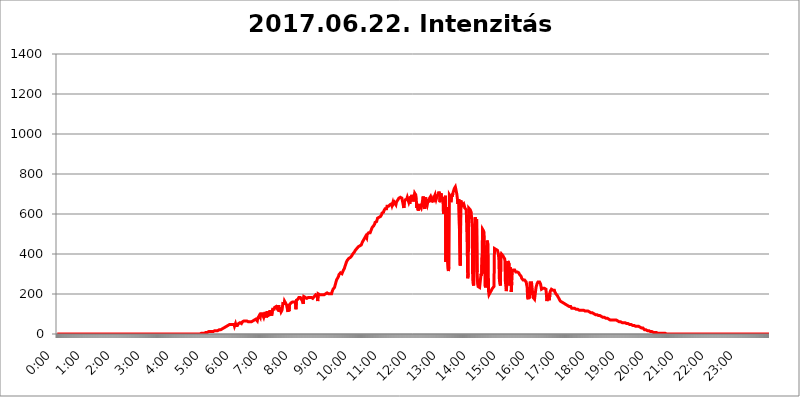
| Category | 2017.06.22. Intenzitás [W/m^2] |
|---|---|
| 0.0 | 0 |
| 0.0006944444444444445 | 0 |
| 0.001388888888888889 | 0 |
| 0.0020833333333333333 | 0 |
| 0.002777777777777778 | 0 |
| 0.003472222222222222 | 0 |
| 0.004166666666666667 | 0 |
| 0.004861111111111111 | 0 |
| 0.005555555555555556 | 0 |
| 0.0062499999999999995 | 0 |
| 0.006944444444444444 | 0 |
| 0.007638888888888889 | 0 |
| 0.008333333333333333 | 0 |
| 0.009027777777777779 | 0 |
| 0.009722222222222222 | 0 |
| 0.010416666666666666 | 0 |
| 0.011111111111111112 | 0 |
| 0.011805555555555555 | 0 |
| 0.012499999999999999 | 0 |
| 0.013194444444444444 | 0 |
| 0.013888888888888888 | 0 |
| 0.014583333333333332 | 0 |
| 0.015277777777777777 | 0 |
| 0.015972222222222224 | 0 |
| 0.016666666666666666 | 0 |
| 0.017361111111111112 | 0 |
| 0.018055555555555557 | 0 |
| 0.01875 | 0 |
| 0.019444444444444445 | 0 |
| 0.02013888888888889 | 0 |
| 0.020833333333333332 | 0 |
| 0.02152777777777778 | 0 |
| 0.022222222222222223 | 0 |
| 0.02291666666666667 | 0 |
| 0.02361111111111111 | 0 |
| 0.024305555555555556 | 0 |
| 0.024999999999999998 | 0 |
| 0.025694444444444447 | 0 |
| 0.02638888888888889 | 0 |
| 0.027083333333333334 | 0 |
| 0.027777777777777776 | 0 |
| 0.02847222222222222 | 0 |
| 0.029166666666666664 | 0 |
| 0.029861111111111113 | 0 |
| 0.030555555555555555 | 0 |
| 0.03125 | 0 |
| 0.03194444444444445 | 0 |
| 0.03263888888888889 | 0 |
| 0.03333333333333333 | 0 |
| 0.034027777777777775 | 0 |
| 0.034722222222222224 | 0 |
| 0.035416666666666666 | 0 |
| 0.036111111111111115 | 0 |
| 0.03680555555555556 | 0 |
| 0.0375 | 0 |
| 0.03819444444444444 | 0 |
| 0.03888888888888889 | 0 |
| 0.03958333333333333 | 0 |
| 0.04027777777777778 | 0 |
| 0.04097222222222222 | 0 |
| 0.041666666666666664 | 0 |
| 0.042361111111111106 | 0 |
| 0.04305555555555556 | 0 |
| 0.043750000000000004 | 0 |
| 0.044444444444444446 | 0 |
| 0.04513888888888889 | 0 |
| 0.04583333333333334 | 0 |
| 0.04652777777777778 | 0 |
| 0.04722222222222222 | 0 |
| 0.04791666666666666 | 0 |
| 0.04861111111111111 | 0 |
| 0.049305555555555554 | 0 |
| 0.049999999999999996 | 0 |
| 0.05069444444444445 | 0 |
| 0.051388888888888894 | 0 |
| 0.052083333333333336 | 0 |
| 0.05277777777777778 | 0 |
| 0.05347222222222222 | 0 |
| 0.05416666666666667 | 0 |
| 0.05486111111111111 | 0 |
| 0.05555555555555555 | 0 |
| 0.05625 | 0 |
| 0.05694444444444444 | 0 |
| 0.057638888888888885 | 0 |
| 0.05833333333333333 | 0 |
| 0.05902777777777778 | 0 |
| 0.059722222222222225 | 0 |
| 0.06041666666666667 | 0 |
| 0.061111111111111116 | 0 |
| 0.06180555555555556 | 0 |
| 0.0625 | 0 |
| 0.06319444444444444 | 0 |
| 0.06388888888888888 | 0 |
| 0.06458333333333334 | 0 |
| 0.06527777777777778 | 0 |
| 0.06597222222222222 | 0 |
| 0.06666666666666667 | 0 |
| 0.06736111111111111 | 0 |
| 0.06805555555555555 | 0 |
| 0.06874999999999999 | 0 |
| 0.06944444444444443 | 0 |
| 0.07013888888888889 | 0 |
| 0.07083333333333333 | 0 |
| 0.07152777777777779 | 0 |
| 0.07222222222222223 | 0 |
| 0.07291666666666667 | 0 |
| 0.07361111111111111 | 0 |
| 0.07430555555555556 | 0 |
| 0.075 | 0 |
| 0.07569444444444444 | 0 |
| 0.0763888888888889 | 0 |
| 0.07708333333333334 | 0 |
| 0.07777777777777778 | 0 |
| 0.07847222222222222 | 0 |
| 0.07916666666666666 | 0 |
| 0.0798611111111111 | 0 |
| 0.08055555555555556 | 0 |
| 0.08125 | 0 |
| 0.08194444444444444 | 0 |
| 0.08263888888888889 | 0 |
| 0.08333333333333333 | 0 |
| 0.08402777777777777 | 0 |
| 0.08472222222222221 | 0 |
| 0.08541666666666665 | 0 |
| 0.08611111111111112 | 0 |
| 0.08680555555555557 | 0 |
| 0.08750000000000001 | 0 |
| 0.08819444444444445 | 0 |
| 0.08888888888888889 | 0 |
| 0.08958333333333333 | 0 |
| 0.09027777777777778 | 0 |
| 0.09097222222222222 | 0 |
| 0.09166666666666667 | 0 |
| 0.09236111111111112 | 0 |
| 0.09305555555555556 | 0 |
| 0.09375 | 0 |
| 0.09444444444444444 | 0 |
| 0.09513888888888888 | 0 |
| 0.09583333333333333 | 0 |
| 0.09652777777777777 | 0 |
| 0.09722222222222222 | 0 |
| 0.09791666666666667 | 0 |
| 0.09861111111111111 | 0 |
| 0.09930555555555555 | 0 |
| 0.09999999999999999 | 0 |
| 0.10069444444444443 | 0 |
| 0.1013888888888889 | 0 |
| 0.10208333333333335 | 0 |
| 0.10277777777777779 | 0 |
| 0.10347222222222223 | 0 |
| 0.10416666666666667 | 0 |
| 0.10486111111111111 | 0 |
| 0.10555555555555556 | 0 |
| 0.10625 | 0 |
| 0.10694444444444444 | 0 |
| 0.1076388888888889 | 0 |
| 0.10833333333333334 | 0 |
| 0.10902777777777778 | 0 |
| 0.10972222222222222 | 0 |
| 0.1111111111111111 | 0 |
| 0.11180555555555556 | 0 |
| 0.11180555555555556 | 0 |
| 0.1125 | 0 |
| 0.11319444444444444 | 0 |
| 0.11388888888888889 | 0 |
| 0.11458333333333333 | 0 |
| 0.11527777777777777 | 0 |
| 0.11597222222222221 | 0 |
| 0.11666666666666665 | 0 |
| 0.1173611111111111 | 0 |
| 0.11805555555555557 | 0 |
| 0.11944444444444445 | 0 |
| 0.12013888888888889 | 0 |
| 0.12083333333333333 | 0 |
| 0.12152777777777778 | 0 |
| 0.12222222222222223 | 0 |
| 0.12291666666666667 | 0 |
| 0.12291666666666667 | 0 |
| 0.12361111111111112 | 0 |
| 0.12430555555555556 | 0 |
| 0.125 | 0 |
| 0.12569444444444444 | 0 |
| 0.12638888888888888 | 0 |
| 0.12708333333333333 | 0 |
| 0.16875 | 0 |
| 0.12847222222222224 | 0 |
| 0.12916666666666668 | 0 |
| 0.12986111111111112 | 0 |
| 0.13055555555555556 | 0 |
| 0.13125 | 0 |
| 0.13194444444444445 | 0 |
| 0.1326388888888889 | 0 |
| 0.13333333333333333 | 0 |
| 0.13402777777777777 | 0 |
| 0.13402777777777777 | 0 |
| 0.13472222222222222 | 0 |
| 0.13541666666666666 | 0 |
| 0.1361111111111111 | 0 |
| 0.13749999999999998 | 0 |
| 0.13819444444444443 | 0 |
| 0.1388888888888889 | 0 |
| 0.13958333333333334 | 0 |
| 0.14027777777777778 | 0 |
| 0.14097222222222222 | 0 |
| 0.14166666666666666 | 0 |
| 0.1423611111111111 | 0 |
| 0.14305555555555557 | 0 |
| 0.14375000000000002 | 0 |
| 0.14444444444444446 | 0 |
| 0.1451388888888889 | 0 |
| 0.1451388888888889 | 0 |
| 0.14652777777777778 | 0 |
| 0.14722222222222223 | 0 |
| 0.14791666666666667 | 0 |
| 0.1486111111111111 | 0 |
| 0.14930555555555555 | 0 |
| 0.15 | 0 |
| 0.15069444444444444 | 0 |
| 0.15138888888888888 | 0 |
| 0.15208333333333332 | 0 |
| 0.15277777777777776 | 0 |
| 0.15347222222222223 | 0 |
| 0.15416666666666667 | 0 |
| 0.15486111111111112 | 0 |
| 0.15555555555555556 | 0 |
| 0.15625 | 0 |
| 0.15694444444444444 | 0 |
| 0.15763888888888888 | 0 |
| 0.15833333333333333 | 0 |
| 0.15902777777777777 | 0 |
| 0.15972222222222224 | 0 |
| 0.16041666666666668 | 0 |
| 0.16111111111111112 | 0 |
| 0.16180555555555556 | 0 |
| 0.1625 | 0 |
| 0.16319444444444445 | 0 |
| 0.1638888888888889 | 0 |
| 0.16458333333333333 | 0 |
| 0.16527777777777777 | 0 |
| 0.16597222222222222 | 0 |
| 0.16666666666666666 | 0 |
| 0.1673611111111111 | 0 |
| 0.16805555555555554 | 0 |
| 0.16874999999999998 | 0 |
| 0.16944444444444443 | 0 |
| 0.17013888888888887 | 0 |
| 0.1708333333333333 | 0 |
| 0.17152777777777775 | 0 |
| 0.17222222222222225 | 0 |
| 0.1729166666666667 | 0 |
| 0.17361111111111113 | 0 |
| 0.17430555555555557 | 0 |
| 0.17500000000000002 | 0 |
| 0.17569444444444446 | 0 |
| 0.1763888888888889 | 0 |
| 0.17708333333333334 | 0 |
| 0.17777777777777778 | 0 |
| 0.17847222222222223 | 0 |
| 0.17916666666666667 | 0 |
| 0.1798611111111111 | 0 |
| 0.18055555555555555 | 0 |
| 0.18125 | 0 |
| 0.18194444444444444 | 0 |
| 0.1826388888888889 | 0 |
| 0.18333333333333335 | 0 |
| 0.1840277777777778 | 0 |
| 0.18472222222222223 | 0 |
| 0.18541666666666667 | 0 |
| 0.18611111111111112 | 0 |
| 0.18680555555555556 | 0 |
| 0.1875 | 0 |
| 0.18819444444444444 | 0 |
| 0.18888888888888888 | 0 |
| 0.18958333333333333 | 0 |
| 0.19027777777777777 | 0 |
| 0.1909722222222222 | 0 |
| 0.19166666666666665 | 0 |
| 0.19236111111111112 | 0 |
| 0.19305555555555554 | 0 |
| 0.19375 | 0 |
| 0.19444444444444445 | 0 |
| 0.1951388888888889 | 0 |
| 0.19583333333333333 | 0 |
| 0.19652777777777777 | 0 |
| 0.19722222222222222 | 0 |
| 0.19791666666666666 | 0 |
| 0.1986111111111111 | 0 |
| 0.19930555555555554 | 0 |
| 0.19999999999999998 | 0 |
| 0.20069444444444443 | 0 |
| 0.20138888888888887 | 3.525 |
| 0.2020833333333333 | 3.525 |
| 0.2027777777777778 | 3.525 |
| 0.2034722222222222 | 3.525 |
| 0.2041666666666667 | 3.525 |
| 0.20486111111111113 | 3.525 |
| 0.20555555555555557 | 3.525 |
| 0.20625000000000002 | 3.525 |
| 0.20694444444444446 | 3.525 |
| 0.2076388888888889 | 3.525 |
| 0.20833333333333334 | 7.887 |
| 0.20902777777777778 | 7.887 |
| 0.20972222222222223 | 7.887 |
| 0.21041666666666667 | 7.887 |
| 0.2111111111111111 | 7.887 |
| 0.21180555555555555 | 12.257 |
| 0.2125 | 12.257 |
| 0.21319444444444444 | 12.257 |
| 0.2138888888888889 | 12.257 |
| 0.21458333333333335 | 12.257 |
| 0.2152777777777778 | 12.257 |
| 0.21597222222222223 | 12.257 |
| 0.21666666666666667 | 12.257 |
| 0.21736111111111112 | 12.257 |
| 0.21805555555555556 | 12.257 |
| 0.21875 | 12.257 |
| 0.21944444444444444 | 16.636 |
| 0.22013888888888888 | 16.636 |
| 0.22083333333333333 | 16.636 |
| 0.22152777777777777 | 16.636 |
| 0.2222222222222222 | 16.636 |
| 0.22291666666666665 | 16.636 |
| 0.2236111111111111 | 16.636 |
| 0.22430555555555556 | 16.636 |
| 0.225 | 16.636 |
| 0.22569444444444445 | 16.636 |
| 0.2263888888888889 | 21.024 |
| 0.22708333333333333 | 21.024 |
| 0.22777777777777777 | 21.024 |
| 0.22847222222222222 | 21.024 |
| 0.22916666666666666 | 21.024 |
| 0.2298611111111111 | 21.024 |
| 0.23055555555555554 | 21.024 |
| 0.23124999999999998 | 25.419 |
| 0.23194444444444443 | 25.419 |
| 0.23263888888888887 | 29.823 |
| 0.2333333333333333 | 29.823 |
| 0.2340277777777778 | 29.823 |
| 0.2347222222222222 | 34.234 |
| 0.2354166666666667 | 34.234 |
| 0.23611111111111113 | 38.653 |
| 0.23680555555555557 | 38.653 |
| 0.23750000000000002 | 38.653 |
| 0.23819444444444446 | 38.653 |
| 0.2388888888888889 | 38.653 |
| 0.23958333333333334 | 43.079 |
| 0.24027777777777778 | 43.079 |
| 0.24097222222222223 | 47.511 |
| 0.24166666666666667 | 47.511 |
| 0.2423611111111111 | 47.511 |
| 0.24305555555555555 | 47.511 |
| 0.24375 | 47.511 |
| 0.24444444444444446 | 47.511 |
| 0.24513888888888888 | 47.511 |
| 0.24583333333333335 | 47.511 |
| 0.2465277777777778 | 51.951 |
| 0.24722222222222223 | 51.951 |
| 0.24791666666666667 | 47.511 |
| 0.24861111111111112 | 38.653 |
| 0.24930555555555556 | 38.653 |
| 0.25 | 51.951 |
| 0.25069444444444444 | 43.079 |
| 0.2513888888888889 | 47.511 |
| 0.2520833333333333 | 43.079 |
| 0.25277777777777777 | 43.079 |
| 0.2534722222222222 | 47.511 |
| 0.25416666666666665 | 51.951 |
| 0.2548611111111111 | 51.951 |
| 0.2555555555555556 | 56.398 |
| 0.25625000000000003 | 56.398 |
| 0.2569444444444445 | 51.951 |
| 0.2576388888888889 | 51.951 |
| 0.25833333333333336 | 51.951 |
| 0.2590277777777778 | 56.398 |
| 0.25972222222222224 | 60.85 |
| 0.2604166666666667 | 60.85 |
| 0.2611111111111111 | 60.85 |
| 0.26180555555555557 | 65.31 |
| 0.2625 | 65.31 |
| 0.26319444444444445 | 65.31 |
| 0.2638888888888889 | 65.31 |
| 0.26458333333333334 | 65.31 |
| 0.2652777777777778 | 65.31 |
| 0.2659722222222222 | 65.31 |
| 0.26666666666666666 | 60.85 |
| 0.2673611111111111 | 60.85 |
| 0.26805555555555555 | 60.85 |
| 0.26875 | 60.85 |
| 0.26944444444444443 | 60.85 |
| 0.2701388888888889 | 60.85 |
| 0.2708333333333333 | 60.85 |
| 0.27152777777777776 | 60.85 |
| 0.2722222222222222 | 60.85 |
| 0.27291666666666664 | 60.85 |
| 0.2736111111111111 | 65.31 |
| 0.2743055555555555 | 65.31 |
| 0.27499999999999997 | 65.31 |
| 0.27569444444444446 | 69.775 |
| 0.27638888888888885 | 69.775 |
| 0.27708333333333335 | 69.775 |
| 0.2777777777777778 | 69.775 |
| 0.27847222222222223 | 74.246 |
| 0.2791666666666667 | 74.246 |
| 0.2798611111111111 | 78.722 |
| 0.28055555555555556 | 65.31 |
| 0.28125 | 78.722 |
| 0.28194444444444444 | 83.205 |
| 0.2826388888888889 | 83.205 |
| 0.2833333333333333 | 92.184 |
| 0.28402777777777777 | 92.184 |
| 0.2847222222222222 | 83.205 |
| 0.28541666666666665 | 101.184 |
| 0.28611111111111115 | 101.184 |
| 0.28680555555555554 | 101.184 |
| 0.28750000000000003 | 101.184 |
| 0.2881944444444445 | 101.184 |
| 0.2888888888888889 | 101.184 |
| 0.28958333333333336 | 83.205 |
| 0.2902777777777778 | 83.205 |
| 0.29097222222222224 | 101.184 |
| 0.2916666666666667 | 110.201 |
| 0.2923611111111111 | 105.69 |
| 0.29305555555555557 | 83.205 |
| 0.29375 | 96.682 |
| 0.29444444444444445 | 114.716 |
| 0.2951388888888889 | 114.716 |
| 0.29583333333333334 | 92.184 |
| 0.2965277777777778 | 87.692 |
| 0.2972222222222222 | 96.682 |
| 0.29791666666666666 | 96.682 |
| 0.2986111111111111 | 119.235 |
| 0.29930555555555555 | 119.235 |
| 0.3 | 114.716 |
| 0.30069444444444443 | 92.184 |
| 0.3013888888888889 | 92.184 |
| 0.3020833333333333 | 123.758 |
| 0.30277777777777776 | 123.758 |
| 0.3034722222222222 | 123.758 |
| 0.30416666666666664 | 123.758 |
| 0.3048611111111111 | 132.814 |
| 0.3055555555555555 | 132.814 |
| 0.30624999999999997 | 132.814 |
| 0.3069444444444444 | 137.347 |
| 0.3076388888888889 | 137.347 |
| 0.30833333333333335 | 128.284 |
| 0.3090277777777778 | 137.347 |
| 0.30972222222222223 | 137.347 |
| 0.3104166666666667 | 141.884 |
| 0.3111111111111111 | 137.347 |
| 0.31180555555555556 | 110.201 |
| 0.3125 | 132.814 |
| 0.31319444444444444 | 119.235 |
| 0.3138888888888889 | 110.201 |
| 0.3145833333333333 | 110.201 |
| 0.31527777777777777 | 119.235 |
| 0.3159722222222222 | 119.235 |
| 0.31666666666666665 | 160.056 |
| 0.31736111111111115 | 164.605 |
| 0.31805555555555554 | 146.423 |
| 0.31875000000000003 | 164.605 |
| 0.3194444444444445 | 160.056 |
| 0.3201388888888889 | 155.509 |
| 0.32083333333333336 | 155.509 |
| 0.3215277777777778 | 146.423 |
| 0.32222222222222224 | 146.423 |
| 0.3229166666666667 | 146.423 |
| 0.3236111111111111 | 110.201 |
| 0.32430555555555557 | 141.884 |
| 0.325 | 114.716 |
| 0.32569444444444445 | 146.423 |
| 0.3263888888888889 | 150.964 |
| 0.32708333333333334 | 150.964 |
| 0.3277777777777778 | 155.509 |
| 0.3284722222222222 | 155.509 |
| 0.32916666666666666 | 155.509 |
| 0.3298611111111111 | 160.056 |
| 0.33055555555555555 | 160.056 |
| 0.33125 | 160.056 |
| 0.33194444444444443 | 160.056 |
| 0.3326388888888889 | 160.056 |
| 0.3333333333333333 | 160.056 |
| 0.3340277777777778 | 160.056 |
| 0.3347222222222222 | 123.758 |
| 0.3354166666666667 | 169.156 |
| 0.3361111111111111 | 173.709 |
| 0.3368055555555556 | 173.709 |
| 0.33749999999999997 | 173.709 |
| 0.33819444444444446 | 178.264 |
| 0.33888888888888885 | 182.82 |
| 0.33958333333333335 | 182.82 |
| 0.34027777777777773 | 182.82 |
| 0.34097222222222223 | 182.82 |
| 0.3416666666666666 | 182.82 |
| 0.3423611111111111 | 182.82 |
| 0.3430555555555555 | 169.156 |
| 0.34375 | 178.264 |
| 0.3444444444444445 | 160.056 |
| 0.3451388888888889 | 150.964 |
| 0.3458333333333334 | 187.378 |
| 0.34652777777777777 | 187.378 |
| 0.34722222222222227 | 187.378 |
| 0.34791666666666665 | 182.82 |
| 0.34861111111111115 | 187.378 |
| 0.34930555555555554 | 178.264 |
| 0.35000000000000003 | 178.264 |
| 0.3506944444444444 | 178.264 |
| 0.3513888888888889 | 182.82 |
| 0.3520833333333333 | 182.82 |
| 0.3527777777777778 | 187.378 |
| 0.3534722222222222 | 182.82 |
| 0.3541666666666667 | 182.82 |
| 0.3548611111111111 | 182.82 |
| 0.35555555555555557 | 182.82 |
| 0.35625 | 182.82 |
| 0.35694444444444445 | 182.82 |
| 0.3576388888888889 | 182.82 |
| 0.35833333333333334 | 178.264 |
| 0.3590277777777778 | 182.82 |
| 0.3597222222222222 | 182.82 |
| 0.36041666666666666 | 187.378 |
| 0.3611111111111111 | 191.937 |
| 0.36180555555555555 | 191.937 |
| 0.3625 | 196.497 |
| 0.36319444444444443 | 196.497 |
| 0.3638888888888889 | 201.058 |
| 0.3645833333333333 | 191.937 |
| 0.3652777777777778 | 164.605 |
| 0.3659722222222222 | 201.058 |
| 0.3666666666666667 | 196.497 |
| 0.3673611111111111 | 196.497 |
| 0.3680555555555556 | 196.497 |
| 0.36874999999999997 | 196.497 |
| 0.36944444444444446 | 196.497 |
| 0.37013888888888885 | 196.497 |
| 0.37083333333333335 | 196.497 |
| 0.37152777777777773 | 196.497 |
| 0.37222222222222223 | 196.497 |
| 0.3729166666666666 | 191.937 |
| 0.3736111111111111 | 196.497 |
| 0.3743055555555555 | 196.497 |
| 0.375 | 196.497 |
| 0.3756944444444445 | 201.058 |
| 0.3763888888888889 | 201.058 |
| 0.3770833333333334 | 201.058 |
| 0.37777777777777777 | 201.058 |
| 0.37847222222222227 | 205.62 |
| 0.37916666666666665 | 201.058 |
| 0.37986111111111115 | 201.058 |
| 0.38055555555555554 | 201.058 |
| 0.38125000000000003 | 205.62 |
| 0.3819444444444444 | 201.058 |
| 0.3826388888888889 | 201.058 |
| 0.3833333333333333 | 201.058 |
| 0.3840277777777778 | 205.62 |
| 0.3847222222222222 | 201.058 |
| 0.3854166666666667 | 210.182 |
| 0.3861111111111111 | 214.746 |
| 0.38680555555555557 | 223.873 |
| 0.3875 | 219.309 |
| 0.38819444444444445 | 223.873 |
| 0.3888888888888889 | 233 |
| 0.38958333333333334 | 242.127 |
| 0.3902777777777778 | 251.251 |
| 0.3909722222222222 | 260.373 |
| 0.39166666666666666 | 269.49 |
| 0.3923611111111111 | 274.047 |
| 0.39305555555555555 | 278.603 |
| 0.39375 | 283.156 |
| 0.39444444444444443 | 287.709 |
| 0.3951388888888889 | 296.808 |
| 0.3958333333333333 | 296.808 |
| 0.3965277777777778 | 301.354 |
| 0.3972222222222222 | 305.898 |
| 0.3979166666666667 | 305.898 |
| 0.3986111111111111 | 301.354 |
| 0.3993055555555556 | 301.354 |
| 0.39999999999999997 | 296.808 |
| 0.40069444444444446 | 305.898 |
| 0.40138888888888885 | 319.517 |
| 0.40208333333333335 | 324.052 |
| 0.40277777777777773 | 328.584 |
| 0.40347222222222223 | 337.639 |
| 0.4041666666666666 | 342.162 |
| 0.4048611111111111 | 351.198 |
| 0.4055555555555555 | 360.221 |
| 0.40625 | 364.728 |
| 0.4069444444444445 | 369.23 |
| 0.4076388888888889 | 369.23 |
| 0.4083333333333334 | 373.729 |
| 0.40902777777777777 | 378.224 |
| 0.40972222222222227 | 378.224 |
| 0.41041666666666665 | 378.224 |
| 0.41111111111111115 | 382.715 |
| 0.41180555555555554 | 387.202 |
| 0.41250000000000003 | 387.202 |
| 0.4131944444444444 | 391.685 |
| 0.4138888888888889 | 396.164 |
| 0.4145833333333333 | 400.638 |
| 0.4152777777777778 | 405.108 |
| 0.4159722222222222 | 396.164 |
| 0.4166666666666667 | 409.574 |
| 0.4173611111111111 | 414.035 |
| 0.41805555555555557 | 418.492 |
| 0.41875 | 422.943 |
| 0.41944444444444445 | 422.943 |
| 0.4201388888888889 | 427.39 |
| 0.42083333333333334 | 427.39 |
| 0.4215277777777778 | 431.833 |
| 0.4222222222222222 | 436.27 |
| 0.42291666666666666 | 436.27 |
| 0.4236111111111111 | 436.27 |
| 0.42430555555555555 | 440.702 |
| 0.425 | 440.702 |
| 0.42569444444444443 | 440.702 |
| 0.4263888888888889 | 445.129 |
| 0.4270833333333333 | 449.551 |
| 0.4277777777777778 | 458.38 |
| 0.4284722222222222 | 462.786 |
| 0.4291666666666667 | 467.187 |
| 0.4298611111111111 | 471.582 |
| 0.4305555555555556 | 475.972 |
| 0.43124999999999997 | 480.356 |
| 0.43194444444444446 | 480.356 |
| 0.43263888888888885 | 489.108 |
| 0.43333333333333335 | 493.475 |
| 0.43402777777777773 | 480.356 |
| 0.43472222222222223 | 497.836 |
| 0.4354166666666666 | 497.836 |
| 0.4361111111111111 | 497.836 |
| 0.4368055555555555 | 506.542 |
| 0.4375 | 506.542 |
| 0.4381944444444445 | 506.542 |
| 0.4388888888888889 | 506.542 |
| 0.4395833333333334 | 502.192 |
| 0.44027777777777777 | 519.555 |
| 0.44097222222222227 | 523.88 |
| 0.44166666666666665 | 532.513 |
| 0.44236111111111115 | 532.513 |
| 0.44305555555555554 | 536.82 |
| 0.44375000000000003 | 541.121 |
| 0.4444444444444444 | 545.416 |
| 0.4451388888888889 | 549.704 |
| 0.4458333333333333 | 558.261 |
| 0.4465277777777778 | 558.261 |
| 0.4472222222222222 | 558.261 |
| 0.4479166666666667 | 562.53 |
| 0.4486111111111111 | 571.049 |
| 0.44930555555555557 | 579.542 |
| 0.45 | 583.779 |
| 0.45069444444444445 | 583.779 |
| 0.4513888888888889 | 583.779 |
| 0.45208333333333334 | 588.009 |
| 0.4527777777777778 | 588.009 |
| 0.4534722222222222 | 588.009 |
| 0.45416666666666666 | 592.233 |
| 0.4548611111111111 | 596.45 |
| 0.45555555555555555 | 604.864 |
| 0.45625 | 600.661 |
| 0.45694444444444443 | 609.062 |
| 0.4576388888888889 | 609.062 |
| 0.4583333333333333 | 617.436 |
| 0.4590277777777778 | 617.436 |
| 0.4597222222222222 | 625.784 |
| 0.4604166666666667 | 625.784 |
| 0.4611111111111111 | 629.948 |
| 0.4618055555555556 | 625.784 |
| 0.46249999999999997 | 638.256 |
| 0.46319444444444446 | 638.256 |
| 0.46388888888888885 | 638.256 |
| 0.46458333333333335 | 638.256 |
| 0.46527777777777773 | 642.4 |
| 0.46597222222222223 | 642.4 |
| 0.4666666666666666 | 646.537 |
| 0.4673611111111111 | 646.537 |
| 0.4680555555555555 | 646.537 |
| 0.46875 | 650.667 |
| 0.4694444444444445 | 642.4 |
| 0.4701388888888889 | 650.667 |
| 0.4708333333333334 | 658.909 |
| 0.47152777777777777 | 650.667 |
| 0.47222222222222227 | 650.667 |
| 0.47291666666666665 | 658.909 |
| 0.47361111111111115 | 658.909 |
| 0.47430555555555554 | 663.019 |
| 0.47500000000000003 | 646.537 |
| 0.4756944444444444 | 658.909 |
| 0.4763888888888889 | 658.909 |
| 0.4770833333333333 | 658.909 |
| 0.4777777777777778 | 671.22 |
| 0.4784722222222222 | 675.311 |
| 0.4791666666666667 | 679.395 |
| 0.4798611111111111 | 683.473 |
| 0.48055555555555557 | 683.473 |
| 0.48125 | 683.473 |
| 0.48194444444444445 | 683.473 |
| 0.4826388888888889 | 683.473 |
| 0.48333333333333334 | 679.395 |
| 0.4840277777777778 | 667.123 |
| 0.4847222222222222 | 663.019 |
| 0.48541666666666666 | 642.4 |
| 0.4861111111111111 | 629.948 |
| 0.48680555555555555 | 658.909 |
| 0.4875 | 658.909 |
| 0.48819444444444443 | 671.22 |
| 0.4888888888888889 | 671.22 |
| 0.4895833333333333 | 675.311 |
| 0.4902777777777778 | 675.311 |
| 0.4909722222222222 | 683.473 |
| 0.4916666666666667 | 687.544 |
| 0.4923611111111111 | 687.544 |
| 0.4930555555555556 | 658.909 |
| 0.49374999999999997 | 667.123 |
| 0.49444444444444446 | 650.667 |
| 0.49513888888888885 | 687.544 |
| 0.49583333333333335 | 663.019 |
| 0.49652777777777773 | 658.909 |
| 0.49722222222222223 | 695.666 |
| 0.4979166666666666 | 695.666 |
| 0.4986111111111111 | 675.311 |
| 0.4993055555555555 | 691.608 |
| 0.5 | 663.019 |
| 0.5006944444444444 | 658.909 |
| 0.5013888888888889 | 703.762 |
| 0.5020833333333333 | 699.717 |
| 0.5027777777777778 | 695.666 |
| 0.5034722222222222 | 679.395 |
| 0.5041666666666667 | 629.948 |
| 0.5048611111111111 | 650.667 |
| 0.5055555555555555 | 650.667 |
| 0.50625 | 617.436 |
| 0.5069444444444444 | 621.613 |
| 0.5076388888888889 | 634.105 |
| 0.5083333333333333 | 650.667 |
| 0.5090277777777777 | 638.256 |
| 0.5097222222222222 | 638.256 |
| 0.5104166666666666 | 629.948 |
| 0.5111111111111112 | 625.784 |
| 0.5118055555555555 | 654.791 |
| 0.5125000000000001 | 671.22 |
| 0.5131944444444444 | 687.544 |
| 0.513888888888889 | 667.123 |
| 0.5145833333333333 | 634.105 |
| 0.5152777777777778 | 625.784 |
| 0.5159722222222222 | 671.22 |
| 0.5166666666666667 | 683.473 |
| 0.517361111111111 | 654.791 |
| 0.5180555555555556 | 658.909 |
| 0.5187499999999999 | 642.4 |
| 0.5194444444444445 | 654.791 |
| 0.5201388888888888 | 675.311 |
| 0.5208333333333334 | 658.909 |
| 0.5215277777777778 | 654.791 |
| 0.5222222222222223 | 679.395 |
| 0.5229166666666667 | 683.473 |
| 0.5236111111111111 | 687.544 |
| 0.5243055555555556 | 679.395 |
| 0.525 | 658.909 |
| 0.5256944444444445 | 654.791 |
| 0.5263888888888889 | 671.22 |
| 0.5270833333333333 | 658.909 |
| 0.5277777777777778 | 675.311 |
| 0.5284722222222222 | 683.473 |
| 0.5291666666666667 | 679.395 |
| 0.5298611111111111 | 695.666 |
| 0.5305555555555556 | 679.395 |
| 0.53125 | 671.22 |
| 0.5319444444444444 | 679.395 |
| 0.5326388888888889 | 687.544 |
| 0.5333333333333333 | 687.544 |
| 0.5340277777777778 | 695.666 |
| 0.5347222222222222 | 703.762 |
| 0.5354166666666667 | 711.832 |
| 0.5361111111111111 | 699.717 |
| 0.5368055555555555 | 658.909 |
| 0.5375 | 687.544 |
| 0.5381944444444444 | 703.762 |
| 0.5388888888888889 | 687.544 |
| 0.5395833333333333 | 671.22 |
| 0.5402777777777777 | 683.473 |
| 0.5409722222222222 | 675.311 |
| 0.5416666666666666 | 600.661 |
| 0.5423611111111112 | 617.436 |
| 0.5430555555555555 | 617.436 |
| 0.5437500000000001 | 663.019 |
| 0.5444444444444444 | 691.608 |
| 0.545138888888889 | 360.221 |
| 0.5458333333333333 | 634.105 |
| 0.5465277777777778 | 604.864 |
| 0.5472222222222222 | 373.729 |
| 0.5479166666666667 | 328.584 |
| 0.548611111111111 | 314.98 |
| 0.5493055555555556 | 333.113 |
| 0.5499999999999999 | 695.666 |
| 0.5506944444444445 | 695.666 |
| 0.5513888888888888 | 687.544 |
| 0.5520833333333334 | 658.909 |
| 0.5527777777777778 | 658.909 |
| 0.5534722222222223 | 695.666 |
| 0.5541666666666667 | 687.544 |
| 0.5548611111111111 | 703.762 |
| 0.5555555555555556 | 703.762 |
| 0.55625 | 719.877 |
| 0.5569444444444445 | 727.896 |
| 0.5576388888888889 | 731.896 |
| 0.5583333333333333 | 735.89 |
| 0.5590277777777778 | 735.89 |
| 0.5597222222222222 | 711.832 |
| 0.5604166666666667 | 699.717 |
| 0.5611111111111111 | 679.395 |
| 0.5618055555555556 | 650.667 |
| 0.5625 | 667.123 |
| 0.5631944444444444 | 675.311 |
| 0.5638888888888889 | 671.22 |
| 0.5645833333333333 | 675.311 |
| 0.5652777777777778 | 342.162 |
| 0.5659722222222222 | 667.123 |
| 0.5666666666666667 | 654.791 |
| 0.5673611111111111 | 658.909 |
| 0.5680555555555555 | 642.4 |
| 0.56875 | 646.537 |
| 0.5694444444444444 | 638.256 |
| 0.5701388888888889 | 650.667 |
| 0.5708333333333333 | 642.4 |
| 0.5715277777777777 | 629.948 |
| 0.5722222222222222 | 629.948 |
| 0.5729166666666666 | 634.105 |
| 0.5736111111111112 | 621.613 |
| 0.5743055555555555 | 541.121 |
| 0.5750000000000001 | 440.702 |
| 0.5756944444444444 | 278.603 |
| 0.576388888888889 | 301.354 |
| 0.5770833333333333 | 629.948 |
| 0.5777777777777778 | 629.948 |
| 0.5784722222222222 | 634.105 |
| 0.5791666666666667 | 621.613 |
| 0.579861111111111 | 625.784 |
| 0.5805555555555556 | 609.062 |
| 0.5812499999999999 | 609.062 |
| 0.5819444444444445 | 532.513 |
| 0.5826388888888888 | 278.603 |
| 0.5833333333333334 | 251.251 |
| 0.5840277777777778 | 242.127 |
| 0.5847222222222223 | 246.689 |
| 0.5854166666666667 | 549.704 |
| 0.5861111111111111 | 583.779 |
| 0.5868055555555556 | 579.542 |
| 0.5875 | 536.82 |
| 0.5881944444444445 | 575.299 |
| 0.5888888888888889 | 310.44 |
| 0.5895833333333333 | 251.251 |
| 0.5902777777777778 | 237.564 |
| 0.5909722222222222 | 242.127 |
| 0.5916666666666667 | 233 |
| 0.5923611111111111 | 233 |
| 0.5930555555555556 | 233 |
| 0.59375 | 237.564 |
| 0.5944444444444444 | 301.354 |
| 0.5951388888888889 | 292.259 |
| 0.5958333333333333 | 382.715 |
| 0.5965277777777778 | 523.88 |
| 0.5972222222222222 | 523.88 |
| 0.5979166666666667 | 515.223 |
| 0.5986111111111111 | 506.542 |
| 0.5993055555555555 | 409.574 |
| 0.6 | 242.127 |
| 0.6006944444444444 | 233 |
| 0.6013888888888889 | 233 |
| 0.6020833333333333 | 260.373 |
| 0.6027777777777777 | 467.187 |
| 0.6034722222222222 | 458.38 |
| 0.6041666666666666 | 449.551 |
| 0.6048611111111112 | 214.746 |
| 0.6055555555555555 | 196.497 |
| 0.6062500000000001 | 191.937 |
| 0.6069444444444444 | 196.497 |
| 0.607638888888889 | 210.182 |
| 0.6083333333333333 | 210.182 |
| 0.6090277777777778 | 219.309 |
| 0.6097222222222222 | 223.873 |
| 0.6104166666666667 | 228.436 |
| 0.611111111111111 | 228.436 |
| 0.6118055555555556 | 228.436 |
| 0.6124999999999999 | 237.564 |
| 0.6131944444444445 | 427.39 |
| 0.6138888888888888 | 431.833 |
| 0.6145833333333334 | 431.833 |
| 0.6152777777777778 | 422.943 |
| 0.6159722222222223 | 427.39 |
| 0.6166666666666667 | 422.943 |
| 0.6173611111111111 | 418.492 |
| 0.6180555555555556 | 414.035 |
| 0.61875 | 400.638 |
| 0.6194444444444445 | 369.23 |
| 0.6201388888888889 | 269.49 |
| 0.6208333333333333 | 251.251 |
| 0.6215277777777778 | 242.127 |
| 0.6222222222222222 | 391.685 |
| 0.6229166666666667 | 400.638 |
| 0.6236111111111111 | 400.638 |
| 0.6243055555555556 | 396.164 |
| 0.625 | 391.685 |
| 0.6256944444444444 | 387.202 |
| 0.6263888888888889 | 382.715 |
| 0.6270833333333333 | 382.715 |
| 0.6277777777777778 | 373.729 |
| 0.6284722222222222 | 264.932 |
| 0.6291666666666667 | 269.49 |
| 0.6298611111111111 | 214.746 |
| 0.6305555555555555 | 210.182 |
| 0.63125 | 214.746 |
| 0.6319444444444444 | 364.728 |
| 0.6326388888888889 | 364.728 |
| 0.6333333333333333 | 360.221 |
| 0.6340277777777777 | 346.682 |
| 0.6347222222222222 | 242.127 |
| 0.6354166666666666 | 333.113 |
| 0.6361111111111112 | 314.98 |
| 0.6368055555555555 | 210.182 |
| 0.6375000000000001 | 260.373 |
| 0.6381944444444444 | 310.44 |
| 0.638888888888889 | 314.98 |
| 0.6395833333333333 | 319.517 |
| 0.6402777777777778 | 324.052 |
| 0.6409722222222222 | 324.052 |
| 0.6416666666666667 | 319.517 |
| 0.642361111111111 | 314.98 |
| 0.6430555555555556 | 310.44 |
| 0.6437499999999999 | 310.44 |
| 0.6444444444444445 | 310.44 |
| 0.6451388888888888 | 310.44 |
| 0.6458333333333334 | 310.44 |
| 0.6465277777777778 | 310.44 |
| 0.6472222222222223 | 305.898 |
| 0.6479166666666667 | 301.354 |
| 0.6486111111111111 | 296.808 |
| 0.6493055555555556 | 301.354 |
| 0.65 | 292.259 |
| 0.6506944444444445 | 287.709 |
| 0.6513888888888889 | 278.603 |
| 0.6520833333333333 | 274.047 |
| 0.6527777777777778 | 274.047 |
| 0.6534722222222222 | 269.49 |
| 0.6541666666666667 | 269.49 |
| 0.6548611111111111 | 269.49 |
| 0.6555555555555556 | 269.49 |
| 0.65625 | 269.49 |
| 0.6569444444444444 | 264.932 |
| 0.6576388888888889 | 260.373 |
| 0.6583333333333333 | 260.373 |
| 0.6590277777777778 | 233 |
| 0.6597222222222222 | 182.82 |
| 0.6604166666666667 | 173.709 |
| 0.6611111111111111 | 233 |
| 0.6618055555555555 | 178.264 |
| 0.6625 | 191.937 |
| 0.6631944444444444 | 255.813 |
| 0.6638888888888889 | 260.373 |
| 0.6645833333333333 | 255.813 |
| 0.6652777777777777 | 255.813 |
| 0.6659722222222222 | 255.813 |
| 0.6666666666666666 | 251.251 |
| 0.6673611111111111 | 182.82 |
| 0.6680555555555556 | 182.82 |
| 0.6687500000000001 | 178.264 |
| 0.6694444444444444 | 173.709 |
| 0.6701388888888888 | 178.264 |
| 0.6708333333333334 | 173.709 |
| 0.6715277777777778 | 233 |
| 0.6722222222222222 | 242.127 |
| 0.6729166666666666 | 251.251 |
| 0.6736111111111112 | 251.251 |
| 0.6743055555555556 | 260.373 |
| 0.6749999999999999 | 260.373 |
| 0.6756944444444444 | 260.373 |
| 0.6763888888888889 | 260.373 |
| 0.6770833333333334 | 260.373 |
| 0.6777777777777777 | 251.251 |
| 0.6784722222222223 | 237.564 |
| 0.6791666666666667 | 223.873 |
| 0.6798611111111111 | 228.436 |
| 0.6805555555555555 | 228.436 |
| 0.68125 | 228.436 |
| 0.6819444444444445 | 233 |
| 0.6826388888888889 | 233 |
| 0.6833333333333332 | 228.436 |
| 0.6840277777777778 | 223.873 |
| 0.6847222222222222 | 223.873 |
| 0.6854166666666667 | 223.873 |
| 0.686111111111111 | 219.309 |
| 0.6868055555555556 | 164.605 |
| 0.6875 | 160.056 |
| 0.6881944444444444 | 201.058 |
| 0.688888888888889 | 201.058 |
| 0.6895833333333333 | 201.058 |
| 0.6902777777777778 | 169.156 |
| 0.6909722222222222 | 205.62 |
| 0.6916666666666668 | 214.746 |
| 0.6923611111111111 | 219.309 |
| 0.6930555555555555 | 223.873 |
| 0.69375 | 223.873 |
| 0.6944444444444445 | 223.873 |
| 0.6951388888888889 | 219.309 |
| 0.6958333333333333 | 223.873 |
| 0.6965277777777777 | 219.309 |
| 0.6972222222222223 | 219.309 |
| 0.6979166666666666 | 210.182 |
| 0.6986111111111111 | 205.62 |
| 0.6993055555555556 | 201.058 |
| 0.7000000000000001 | 201.058 |
| 0.7006944444444444 | 196.497 |
| 0.7013888888888888 | 191.937 |
| 0.7020833333333334 | 187.378 |
| 0.7027777777777778 | 182.82 |
| 0.7034722222222222 | 178.264 |
| 0.7041666666666666 | 173.709 |
| 0.7048611111111112 | 173.709 |
| 0.7055555555555556 | 164.605 |
| 0.7062499999999999 | 160.056 |
| 0.7069444444444444 | 160.056 |
| 0.7076388888888889 | 160.056 |
| 0.7083333333333334 | 155.509 |
| 0.7090277777777777 | 155.509 |
| 0.7097222222222223 | 155.509 |
| 0.7104166666666667 | 155.509 |
| 0.7111111111111111 | 155.509 |
| 0.7118055555555555 | 150.964 |
| 0.7125 | 150.964 |
| 0.7131944444444445 | 150.964 |
| 0.7138888888888889 | 146.423 |
| 0.7145833333333332 | 146.423 |
| 0.7152777777777778 | 141.884 |
| 0.7159722222222222 | 141.884 |
| 0.7166666666666667 | 141.884 |
| 0.717361111111111 | 137.347 |
| 0.7180555555555556 | 137.347 |
| 0.71875 | 137.347 |
| 0.7194444444444444 | 137.347 |
| 0.720138888888889 | 137.347 |
| 0.7208333333333333 | 132.814 |
| 0.7215277777777778 | 128.284 |
| 0.7222222222222222 | 128.284 |
| 0.7229166666666668 | 128.284 |
| 0.7236111111111111 | 128.284 |
| 0.7243055555555555 | 128.284 |
| 0.725 | 128.284 |
| 0.7256944444444445 | 128.284 |
| 0.7263888888888889 | 128.284 |
| 0.7270833333333333 | 128.284 |
| 0.7277777777777777 | 123.758 |
| 0.7284722222222223 | 123.758 |
| 0.7291666666666666 | 123.758 |
| 0.7298611111111111 | 123.758 |
| 0.7305555555555556 | 123.758 |
| 0.7312500000000001 | 123.758 |
| 0.7319444444444444 | 119.235 |
| 0.7326388888888888 | 119.235 |
| 0.7333333333333334 | 119.235 |
| 0.7340277777777778 | 119.235 |
| 0.7347222222222222 | 119.235 |
| 0.7354166666666666 | 119.235 |
| 0.7361111111111112 | 119.235 |
| 0.7368055555555556 | 119.235 |
| 0.7374999999999999 | 114.716 |
| 0.7381944444444444 | 119.235 |
| 0.7388888888888889 | 119.235 |
| 0.7395833333333334 | 114.716 |
| 0.7402777777777777 | 114.716 |
| 0.7409722222222223 | 114.716 |
| 0.7416666666666667 | 114.716 |
| 0.7423611111111111 | 114.716 |
| 0.7430555555555555 | 114.716 |
| 0.74375 | 110.201 |
| 0.7444444444444445 | 114.716 |
| 0.7451388888888889 | 110.201 |
| 0.7458333333333332 | 110.201 |
| 0.7465277777777778 | 110.201 |
| 0.7472222222222222 | 110.201 |
| 0.7479166666666667 | 110.201 |
| 0.748611111111111 | 105.69 |
| 0.7493055555555556 | 105.69 |
| 0.75 | 101.184 |
| 0.7506944444444444 | 105.69 |
| 0.751388888888889 | 101.184 |
| 0.7520833333333333 | 101.184 |
| 0.7527777777777778 | 101.184 |
| 0.7534722222222222 | 101.184 |
| 0.7541666666666668 | 101.184 |
| 0.7548611111111111 | 96.682 |
| 0.7555555555555555 | 96.682 |
| 0.75625 | 96.682 |
| 0.7569444444444445 | 96.682 |
| 0.7576388888888889 | 92.184 |
| 0.7583333333333333 | 92.184 |
| 0.7590277777777777 | 92.184 |
| 0.7597222222222223 | 92.184 |
| 0.7604166666666666 | 92.184 |
| 0.7611111111111111 | 92.184 |
| 0.7618055555555556 | 92.184 |
| 0.7625000000000001 | 87.692 |
| 0.7631944444444444 | 87.692 |
| 0.7638888888888888 | 87.692 |
| 0.7645833333333334 | 83.205 |
| 0.7652777777777778 | 83.205 |
| 0.7659722222222222 | 83.205 |
| 0.7666666666666666 | 83.205 |
| 0.7673611111111112 | 83.205 |
| 0.7680555555555556 | 83.205 |
| 0.7687499999999999 | 83.205 |
| 0.7694444444444444 | 78.722 |
| 0.7701388888888889 | 78.722 |
| 0.7708333333333334 | 78.722 |
| 0.7715277777777777 | 78.722 |
| 0.7722222222222223 | 78.722 |
| 0.7729166666666667 | 74.246 |
| 0.7736111111111111 | 74.246 |
| 0.7743055555555555 | 74.246 |
| 0.775 | 69.775 |
| 0.7756944444444445 | 69.775 |
| 0.7763888888888889 | 69.775 |
| 0.7770833333333332 | 69.775 |
| 0.7777777777777778 | 69.775 |
| 0.7784722222222222 | 69.775 |
| 0.7791666666666667 | 69.775 |
| 0.779861111111111 | 69.775 |
| 0.7805555555555556 | 69.775 |
| 0.78125 | 69.775 |
| 0.7819444444444444 | 69.775 |
| 0.782638888888889 | 69.775 |
| 0.7833333333333333 | 65.31 |
| 0.7840277777777778 | 69.775 |
| 0.7847222222222222 | 65.31 |
| 0.7854166666666668 | 65.31 |
| 0.7861111111111111 | 65.31 |
| 0.7868055555555555 | 60.85 |
| 0.7875 | 60.85 |
| 0.7881944444444445 | 60.85 |
| 0.7888888888888889 | 60.85 |
| 0.7895833333333333 | 60.85 |
| 0.7902777777777777 | 60.85 |
| 0.7909722222222223 | 60.85 |
| 0.7916666666666666 | 56.398 |
| 0.7923611111111111 | 56.398 |
| 0.7930555555555556 | 56.398 |
| 0.7937500000000001 | 56.398 |
| 0.7944444444444444 | 56.398 |
| 0.7951388888888888 | 56.398 |
| 0.7958333333333334 | 56.398 |
| 0.7965277777777778 | 56.398 |
| 0.7972222222222222 | 56.398 |
| 0.7979166666666666 | 51.951 |
| 0.7986111111111112 | 51.951 |
| 0.7993055555555556 | 51.951 |
| 0.7999999999999999 | 51.951 |
| 0.8006944444444444 | 51.951 |
| 0.8013888888888889 | 51.951 |
| 0.8020833333333334 | 47.511 |
| 0.8027777777777777 | 47.511 |
| 0.8034722222222223 | 47.511 |
| 0.8041666666666667 | 47.511 |
| 0.8048611111111111 | 47.511 |
| 0.8055555555555555 | 47.511 |
| 0.80625 | 47.511 |
| 0.8069444444444445 | 43.079 |
| 0.8076388888888889 | 43.079 |
| 0.8083333333333332 | 43.079 |
| 0.8090277777777778 | 43.079 |
| 0.8097222222222222 | 43.079 |
| 0.8104166666666667 | 43.079 |
| 0.811111111111111 | 38.653 |
| 0.8118055555555556 | 38.653 |
| 0.8125 | 38.653 |
| 0.8131944444444444 | 38.653 |
| 0.813888888888889 | 38.653 |
| 0.8145833333333333 | 38.653 |
| 0.8152777777777778 | 38.653 |
| 0.8159722222222222 | 34.234 |
| 0.8166666666666668 | 34.234 |
| 0.8173611111111111 | 34.234 |
| 0.8180555555555555 | 34.234 |
| 0.81875 | 29.823 |
| 0.8194444444444445 | 29.823 |
| 0.8201388888888889 | 29.823 |
| 0.8208333333333333 | 29.823 |
| 0.8215277777777777 | 29.823 |
| 0.8222222222222223 | 25.419 |
| 0.8229166666666666 | 25.419 |
| 0.8236111111111111 | 21.024 |
| 0.8243055555555556 | 21.024 |
| 0.8250000000000001 | 21.024 |
| 0.8256944444444444 | 21.024 |
| 0.8263888888888888 | 21.024 |
| 0.8270833333333334 | 16.636 |
| 0.8277777777777778 | 16.636 |
| 0.8284722222222222 | 16.636 |
| 0.8291666666666666 | 16.636 |
| 0.8298611111111112 | 16.636 |
| 0.8305555555555556 | 12.257 |
| 0.8312499999999999 | 12.257 |
| 0.8319444444444444 | 12.257 |
| 0.8326388888888889 | 12.257 |
| 0.8333333333333334 | 12.257 |
| 0.8340277777777777 | 12.257 |
| 0.8347222222222223 | 12.257 |
| 0.8354166666666667 | 12.257 |
| 0.8361111111111111 | 7.887 |
| 0.8368055555555555 | 7.887 |
| 0.8375 | 7.887 |
| 0.8381944444444445 | 7.887 |
| 0.8388888888888889 | 7.887 |
| 0.8395833333333332 | 7.887 |
| 0.8402777777777778 | 7.887 |
| 0.8409722222222222 | 7.887 |
| 0.8416666666666667 | 7.887 |
| 0.842361111111111 | 3.525 |
| 0.8430555555555556 | 3.525 |
| 0.84375 | 3.525 |
| 0.8444444444444444 | 3.525 |
| 0.845138888888889 | 3.525 |
| 0.8458333333333333 | 3.525 |
| 0.8465277777777778 | 3.525 |
| 0.8472222222222222 | 3.525 |
| 0.8479166666666668 | 3.525 |
| 0.8486111111111111 | 3.525 |
| 0.8493055555555555 | 3.525 |
| 0.85 | 3.525 |
| 0.8506944444444445 | 3.525 |
| 0.8513888888888889 | 0 |
| 0.8520833333333333 | 3.525 |
| 0.8527777777777777 | 3.525 |
| 0.8534722222222223 | 0 |
| 0.8541666666666666 | 0 |
| 0.8548611111111111 | 0 |
| 0.8555555555555556 | 0 |
| 0.8562500000000001 | 0 |
| 0.8569444444444444 | 0 |
| 0.8576388888888888 | 0 |
| 0.8583333333333334 | 0 |
| 0.8590277777777778 | 0 |
| 0.8597222222222222 | 0 |
| 0.8604166666666666 | 0 |
| 0.8611111111111112 | 0 |
| 0.8618055555555556 | 0 |
| 0.8624999999999999 | 0 |
| 0.8631944444444444 | 0 |
| 0.8638888888888889 | 0 |
| 0.8645833333333334 | 0 |
| 0.8652777777777777 | 0 |
| 0.8659722222222223 | 0 |
| 0.8666666666666667 | 0 |
| 0.8673611111111111 | 0 |
| 0.8680555555555555 | 0 |
| 0.86875 | 0 |
| 0.8694444444444445 | 0 |
| 0.8701388888888889 | 0 |
| 0.8708333333333332 | 0 |
| 0.8715277777777778 | 0 |
| 0.8722222222222222 | 0 |
| 0.8729166666666667 | 0 |
| 0.873611111111111 | 0 |
| 0.8743055555555556 | 0 |
| 0.875 | 0 |
| 0.8756944444444444 | 0 |
| 0.876388888888889 | 0 |
| 0.8770833333333333 | 0 |
| 0.8777777777777778 | 0 |
| 0.8784722222222222 | 0 |
| 0.8791666666666668 | 0 |
| 0.8798611111111111 | 0 |
| 0.8805555555555555 | 0 |
| 0.88125 | 0 |
| 0.8819444444444445 | 0 |
| 0.8826388888888889 | 0 |
| 0.8833333333333333 | 0 |
| 0.8840277777777777 | 0 |
| 0.8847222222222223 | 0 |
| 0.8854166666666666 | 0 |
| 0.8861111111111111 | 0 |
| 0.8868055555555556 | 0 |
| 0.8875000000000001 | 0 |
| 0.8881944444444444 | 0 |
| 0.8888888888888888 | 0 |
| 0.8895833333333334 | 0 |
| 0.8902777777777778 | 0 |
| 0.8909722222222222 | 0 |
| 0.8916666666666666 | 0 |
| 0.8923611111111112 | 0 |
| 0.8930555555555556 | 0 |
| 0.8937499999999999 | 0 |
| 0.8944444444444444 | 0 |
| 0.8951388888888889 | 0 |
| 0.8958333333333334 | 0 |
| 0.8965277777777777 | 0 |
| 0.8972222222222223 | 0 |
| 0.8979166666666667 | 0 |
| 0.8986111111111111 | 0 |
| 0.8993055555555555 | 0 |
| 0.9 | 0 |
| 0.9006944444444445 | 0 |
| 0.9013888888888889 | 0 |
| 0.9020833333333332 | 0 |
| 0.9027777777777778 | 0 |
| 0.9034722222222222 | 0 |
| 0.9041666666666667 | 0 |
| 0.904861111111111 | 0 |
| 0.9055555555555556 | 0 |
| 0.90625 | 0 |
| 0.9069444444444444 | 0 |
| 0.907638888888889 | 0 |
| 0.9083333333333333 | 0 |
| 0.9090277777777778 | 0 |
| 0.9097222222222222 | 0 |
| 0.9104166666666668 | 0 |
| 0.9111111111111111 | 0 |
| 0.9118055555555555 | 0 |
| 0.9125 | 0 |
| 0.9131944444444445 | 0 |
| 0.9138888888888889 | 0 |
| 0.9145833333333333 | 0 |
| 0.9152777777777777 | 0 |
| 0.9159722222222223 | 0 |
| 0.9166666666666666 | 0 |
| 0.9173611111111111 | 0 |
| 0.9180555555555556 | 0 |
| 0.9187500000000001 | 0 |
| 0.9194444444444444 | 0 |
| 0.9201388888888888 | 0 |
| 0.9208333333333334 | 0 |
| 0.9215277777777778 | 0 |
| 0.9222222222222222 | 0 |
| 0.9229166666666666 | 0 |
| 0.9236111111111112 | 0 |
| 0.9243055555555556 | 0 |
| 0.9249999999999999 | 0 |
| 0.9256944444444444 | 0 |
| 0.9263888888888889 | 0 |
| 0.9270833333333334 | 0 |
| 0.9277777777777777 | 0 |
| 0.9284722222222223 | 0 |
| 0.9291666666666667 | 0 |
| 0.9298611111111111 | 0 |
| 0.9305555555555555 | 0 |
| 0.93125 | 0 |
| 0.9319444444444445 | 0 |
| 0.9326388888888889 | 0 |
| 0.9333333333333332 | 0 |
| 0.9340277777777778 | 0 |
| 0.9347222222222222 | 0 |
| 0.9354166666666667 | 0 |
| 0.936111111111111 | 0 |
| 0.9368055555555556 | 0 |
| 0.9375 | 0 |
| 0.9381944444444444 | 0 |
| 0.938888888888889 | 0 |
| 0.9395833333333333 | 0 |
| 0.9402777777777778 | 0 |
| 0.9409722222222222 | 0 |
| 0.9416666666666668 | 0 |
| 0.9423611111111111 | 0 |
| 0.9430555555555555 | 0 |
| 0.94375 | 0 |
| 0.9444444444444445 | 0 |
| 0.9451388888888889 | 0 |
| 0.9458333333333333 | 0 |
| 0.9465277777777777 | 0 |
| 0.9472222222222223 | 0 |
| 0.9479166666666666 | 0 |
| 0.9486111111111111 | 0 |
| 0.9493055555555556 | 0 |
| 0.9500000000000001 | 0 |
| 0.9506944444444444 | 0 |
| 0.9513888888888888 | 0 |
| 0.9520833333333334 | 0 |
| 0.9527777777777778 | 0 |
| 0.9534722222222222 | 0 |
| 0.9541666666666666 | 0 |
| 0.9548611111111112 | 0 |
| 0.9555555555555556 | 0 |
| 0.9562499999999999 | 0 |
| 0.9569444444444444 | 0 |
| 0.9576388888888889 | 0 |
| 0.9583333333333334 | 0 |
| 0.9590277777777777 | 0 |
| 0.9597222222222223 | 0 |
| 0.9604166666666667 | 0 |
| 0.9611111111111111 | 0 |
| 0.9618055555555555 | 0 |
| 0.9625 | 0 |
| 0.9631944444444445 | 0 |
| 0.9638888888888889 | 0 |
| 0.9645833333333332 | 0 |
| 0.9652777777777778 | 0 |
| 0.9659722222222222 | 0 |
| 0.9666666666666667 | 0 |
| 0.967361111111111 | 0 |
| 0.9680555555555556 | 0 |
| 0.96875 | 0 |
| 0.9694444444444444 | 0 |
| 0.970138888888889 | 0 |
| 0.9708333333333333 | 0 |
| 0.9715277777777778 | 0 |
| 0.9722222222222222 | 0 |
| 0.9729166666666668 | 0 |
| 0.9736111111111111 | 0 |
| 0.9743055555555555 | 0 |
| 0.975 | 0 |
| 0.9756944444444445 | 0 |
| 0.9763888888888889 | 0 |
| 0.9770833333333333 | 0 |
| 0.9777777777777777 | 0 |
| 0.9784722222222223 | 0 |
| 0.9791666666666666 | 0 |
| 0.9798611111111111 | 0 |
| 0.9805555555555556 | 0 |
| 0.9812500000000001 | 0 |
| 0.9819444444444444 | 0 |
| 0.9826388888888888 | 0 |
| 0.9833333333333334 | 0 |
| 0.9840277777777778 | 0 |
| 0.9847222222222222 | 0 |
| 0.9854166666666666 | 0 |
| 0.9861111111111112 | 0 |
| 0.9868055555555556 | 0 |
| 0.9874999999999999 | 0 |
| 0.9881944444444444 | 0 |
| 0.9888888888888889 | 0 |
| 0.9895833333333334 | 0 |
| 0.9902777777777777 | 0 |
| 0.9909722222222223 | 0 |
| 0.9916666666666667 | 0 |
| 0.9923611111111111 | 0 |
| 0.9930555555555555 | 0 |
| 0.99375 | 0 |
| 0.9944444444444445 | 0 |
| 0.9951388888888889 | 0 |
| 0.9958333333333332 | 0 |
| 0.9965277777777778 | 0 |
| 0.9972222222222222 | 0 |
| 0.9979166666666667 | 0 |
| 0.998611111111111 | 0 |
| 0.9993055555555556 | 0 |